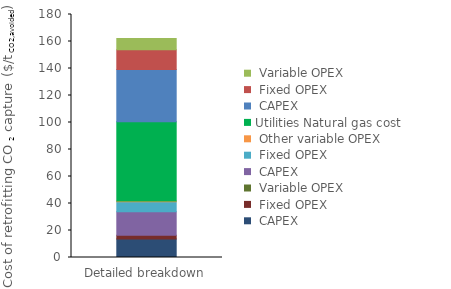
| Category | Interconnecting | Utilities | Series 0 | Series 1 | Series 2 |
|---|---|---|---|---|---|
| 0 | 0 | 58.767 | 38.711 | 14.625 | 8.33 |